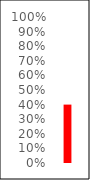
| Category | Percentage Raised |
|---|---|
| 0 | 0.4 |